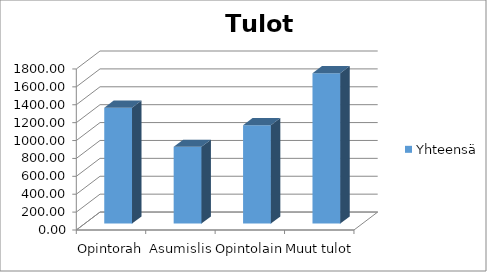
| Category | Yhteensä |
|---|---|
| Opintoraha | 1295 |
| Asumislisä | 857.75 |
| Opintolaina | 1100 |
| Muut tulot | 1680 |